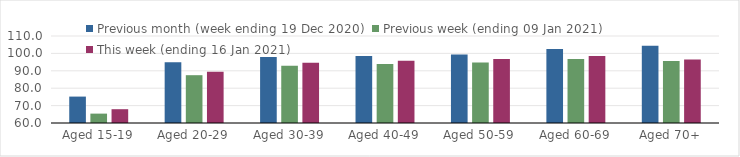
| Category | Previous month (week ending 19 Dec 2020) | Previous week (ending 09 Jan 2021) | This week (ending 16 Jan 2021) |
|---|---|---|---|
| Aged 15-19 | 75.18 | 65.39 | 67.93 |
| Aged 20-29 | 94.92 | 87.48 | 89.5 |
| Aged 30-39 | 97.87 | 92.87 | 94.64 |
| Aged 40-49 | 98.54 | 93.88 | 95.78 |
| Aged 50-59 | 99.33 | 94.76 | 96.78 |
| Aged 60-69 | 102.6 | 96.79 | 98.46 |
| Aged 70+ | 104.35 | 95.62 | 96.43 |